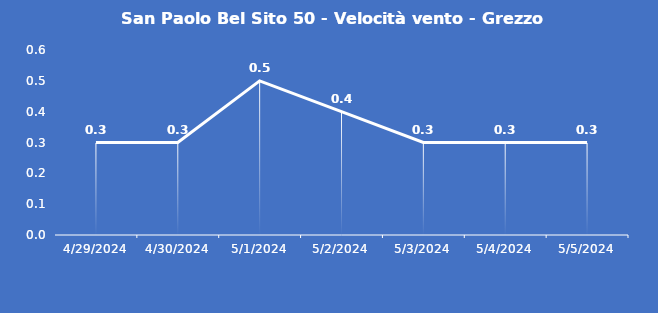
| Category | San Paolo Bel Sito 50 - Velocità vento - Grezzo (m/s) |
|---|---|
| 4/29/24 | 0.3 |
| 4/30/24 | 0.3 |
| 5/1/24 | 0.5 |
| 5/2/24 | 0.4 |
| 5/3/24 | 0.3 |
| 5/4/24 | 0.3 |
| 5/5/24 | 0.3 |